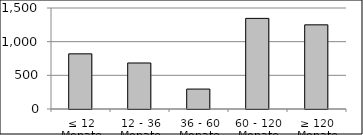
| Category | Volumen |
|---|---|
| ≤ 12 Monate | 819105514 |
| 12 - 36 Monate | 683253969.27 |
| 36 - 60 Monate | 295912486.56 |
| 60 - 120 Monate | 1345832994.151 |
| ≥ 120 Monate | 1249870049.375 |